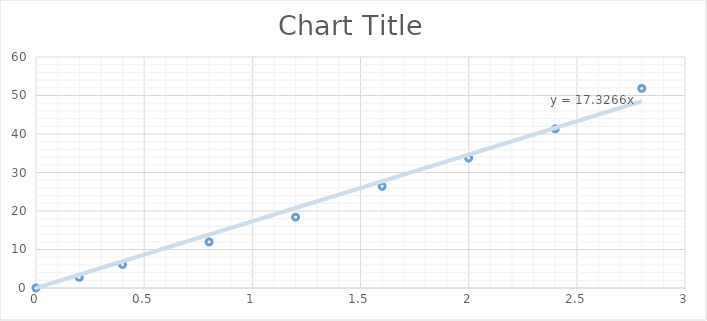
| Category | Series 0 |
|---|---|
| 0.0 | 0 |
| 0.2 | 2.76 |
| 0.4 | 6.1 |
| 0.8 | 11.97 |
| 1.2 | 18.4 |
| 1.6 | 26.42 |
| 2.0 | 33.76 |
| 2.4 | 41.34 |
| 2.8 | 51.84 |